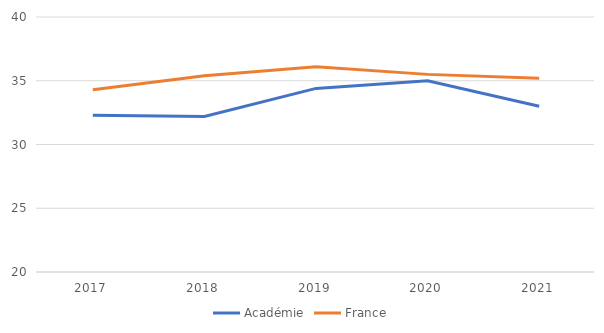
| Category | Académie | France |
|---|---|---|
| 2017.0 | 32.3 | 34.3 |
| 2018.0 | 32.2 | 35.4 |
| 2019.0 | 34.4 | 36.1 |
| 2020.0 | 35 | 35.5 |
| 2021.0 | 33 | 35.2 |